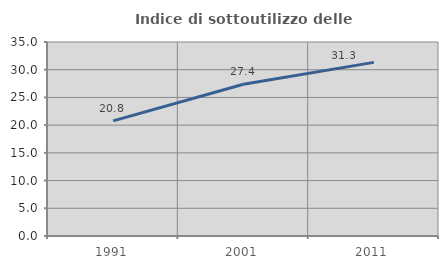
| Category | Indice di sottoutilizzo delle abitazioni  |
|---|---|
| 1991.0 | 20.761 |
| 2001.0 | 27.38 |
| 2011.0 | 31.321 |